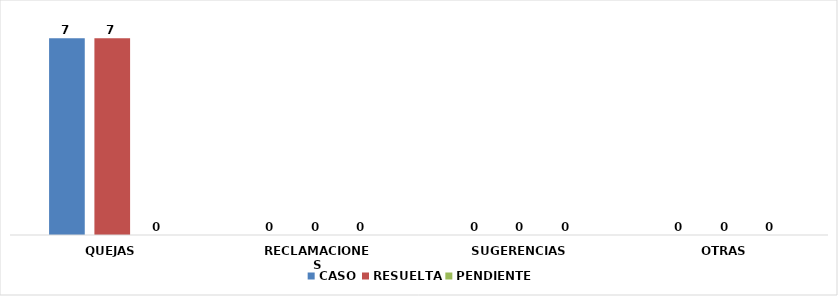
| Category | CASO | RESUELTA | PENDIENTE |
|---|---|---|---|
| QUEJAS | 7 | 7 | 0 |
| RECLAMACIONES | 0 | 0 | 0 |
| SUGERENCIAS | 0 | 0 | 0 |
| OTRAS | 0 | 0 | 0 |